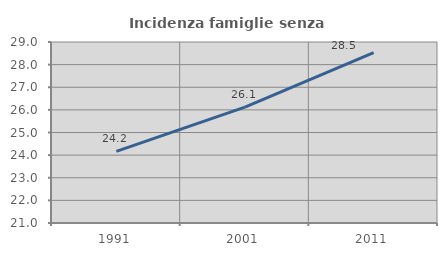
| Category | Incidenza famiglie senza nuclei |
|---|---|
| 1991.0 | 24.168 |
| 2001.0 | 26.124 |
| 2011.0 | 28.525 |